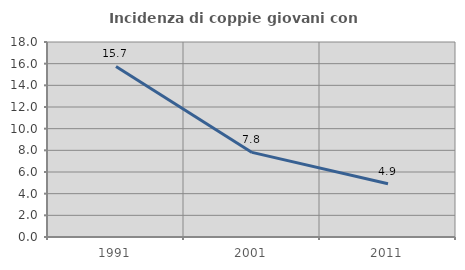
| Category | Incidenza di coppie giovani con figli |
|---|---|
| 1991.0 | 15.743 |
| 2001.0 | 7.809 |
| 2011.0 | 4.913 |